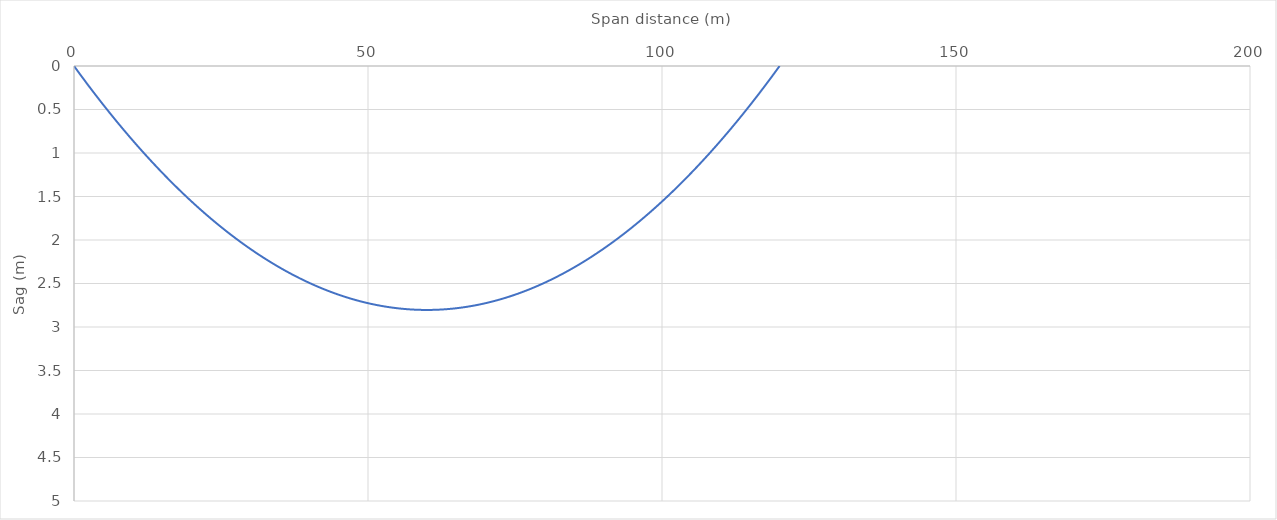
| Category | Sag |
|---|---|
| 0.0 | 0 |
| 1.2 | 0.111 |
| 2.4 | 0.22 |
| 3.5999999999999996 | 0.326 |
| 4.8 | 0.431 |
| 6.0 | 0.533 |
| 7.2 | 0.633 |
| 8.4 | 0.73 |
| 9.6 | 0.825 |
| 10.799999999999999 | 0.919 |
| 11.999999999999998 | 1.009 |
| 13.199999999999998 | 1.098 |
| 14.399999999999997 | 1.184 |
| 15.599999999999996 | 1.269 |
| 16.799999999999997 | 1.35 |
| 17.999999999999996 | 1.43 |
| 19.199999999999996 | 1.507 |
| 20.399999999999995 | 1.583 |
| 21.599999999999994 | 1.655 |
| 22.799999999999994 | 1.726 |
| 23.999999999999993 | 1.795 |
| 25.199999999999992 | 1.861 |
| 26.39999999999999 | 1.925 |
| 27.59999999999999 | 1.986 |
| 28.79999999999999 | 2.046 |
| 29.99999999999999 | 2.103 |
| 31.19999999999999 | 2.158 |
| 32.39999999999999 | 2.211 |
| 33.599999999999994 | 2.261 |
| 34.8 | 2.309 |
| 36.0 | 2.355 |
| 37.2 | 2.399 |
| 38.400000000000006 | 2.441 |
| 39.60000000000001 | 2.48 |
| 40.80000000000001 | 2.517 |
| 42.000000000000014 | 2.552 |
| 43.20000000000002 | 2.584 |
| 44.40000000000002 | 2.614 |
| 45.60000000000002 | 2.642 |
| 46.800000000000026 | 2.668 |
| 48.00000000000003 | 2.692 |
| 49.20000000000003 | 2.713 |
| 50.400000000000034 | 2.732 |
| 51.60000000000004 | 2.749 |
| 52.80000000000004 | 2.764 |
| 54.00000000000004 | 2.776 |
| 55.200000000000045 | 2.786 |
| 56.40000000000005 | 2.794 |
| 57.60000000000005 | 2.8 |
| 58.800000000000054 | 2.803 |
| 60.00000000000006 | 2.804 |
| 61.20000000000006 | 2.803 |
| 62.40000000000006 | 2.8 |
| 63.600000000000065 | 2.794 |
| 64.80000000000007 | 2.786 |
| 66.00000000000007 | 2.776 |
| 67.20000000000007 | 2.764 |
| 68.40000000000008 | 2.749 |
| 69.60000000000008 | 2.732 |
| 70.80000000000008 | 2.713 |
| 72.00000000000009 | 2.692 |
| 73.20000000000009 | 2.668 |
| 74.40000000000009 | 2.642 |
| 75.6000000000001 | 2.614 |
| 76.8000000000001 | 2.584 |
| 78.0000000000001 | 2.552 |
| 79.2000000000001 | 2.517 |
| 80.4000000000001 | 2.48 |
| 81.60000000000011 | 2.441 |
| 82.80000000000011 | 2.399 |
| 84.00000000000011 | 2.355 |
| 85.20000000000012 | 2.309 |
| 86.40000000000012 | 2.261 |
| 87.60000000000012 | 2.211 |
| 88.80000000000013 | 2.158 |
| 90.00000000000013 | 2.103 |
| 91.20000000000013 | 2.046 |
| 92.40000000000013 | 1.986 |
| 93.60000000000014 | 1.925 |
| 94.80000000000014 | 1.861 |
| 96.00000000000014 | 1.795 |
| 97.20000000000014 | 1.726 |
| 98.40000000000015 | 1.655 |
| 99.60000000000015 | 1.583 |
| 100.80000000000015 | 1.507 |
| 102.00000000000016 | 1.43 |
| 103.20000000000016 | 1.35 |
| 104.40000000000016 | 1.269 |
| 105.60000000000016 | 1.184 |
| 106.80000000000017 | 1.098 |
| 108.00000000000017 | 1.009 |
| 109.20000000000017 | 0.919 |
| 110.40000000000018 | 0.825 |
| 111.60000000000018 | 0.73 |
| 112.80000000000018 | 0.633 |
| 114.00000000000018 | 0.533 |
| 115.20000000000019 | 0.431 |
| 116.40000000000019 | 0.326 |
| 117.6000000000002 | 0.22 |
| 118.8000000000002 | 0.111 |
| 120.0000000000002 | 0 |